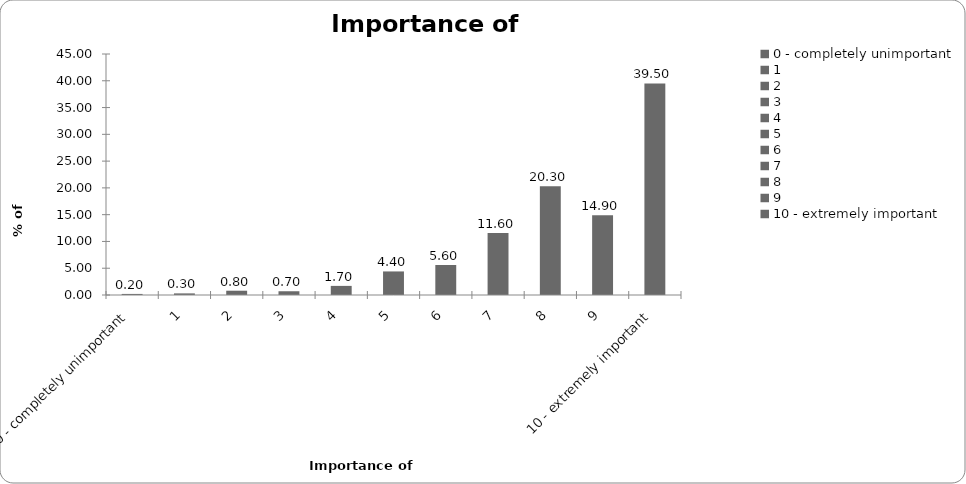
| Category | Importance of insurance |
|---|---|
| 0 - completely unimportant | 0.2 |
| 1 | 0.3 |
| 2 | 0.8 |
| 3 | 0.7 |
| 4 | 1.7 |
| 5 | 4.4 |
| 6 | 5.6 |
| 7 | 11.6 |
| 8 | 20.3 |
| 9 | 14.9 |
| 10 - extremely important | 39.5 |